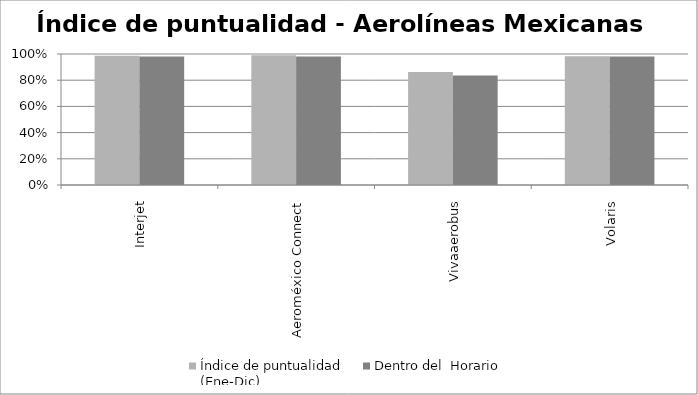
| Category | Índice de puntualidad
(Ene-Dic) | Dentro del  Horario |
|---|---|---|
| Interjet | 0.987 | 0.98 |
| Aeroméxico Connect | 0.991 | 0.982 |
| Vivaaerobus | 0.862 | 0.836 |
| Volaris | 0.984 | 0.98 |